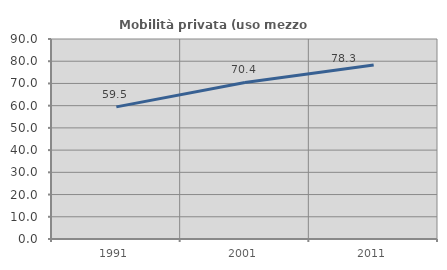
| Category | Mobilità privata (uso mezzo privato) |
|---|---|
| 1991.0 | 59.465 |
| 2001.0 | 70.445 |
| 2011.0 | 78.272 |